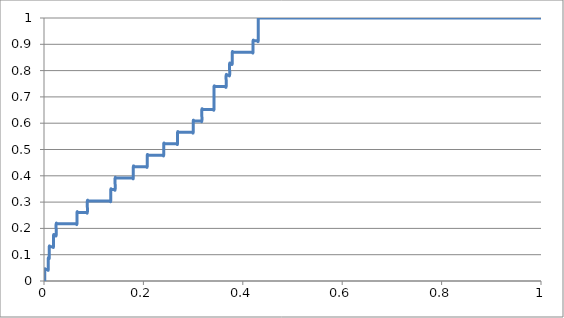
| Category | sens(y) |
|---|---|
| 0.0017452006980802626 | 0 |
| 0.0017452006980802626 | 0.043 |
| 0.003490401396160525 | 0.043 |
| 0.005235602094240788 | 0.043 |
| 0.006980802792321161 | 0.043 |
| 0.008726003490401424 | 0.043 |
| 0.008726003490401424 | 0.087 |
| 0.010471204188481686 | 0.087 |
| 0.010471204188481686 | 0.13 |
| 0.012216404886561949 | 0.13 |
| 0.013961605584642212 | 0.13 |
| 0.015706806282722474 | 0.13 |
| 0.017452006980802848 | 0.13 |
| 0.01919720767888311 | 0.13 |
| 0.01919720767888311 | 0.174 |
| 0.020942408376963373 | 0.174 |
| 0.022687609075043635 | 0.174 |
| 0.024432809773123898 | 0.174 |
| 0.024432809773123898 | 0.217 |
| 0.02617801047120416 | 0.217 |
| 0.027923211169284423 | 0.217 |
| 0.029668411867364797 | 0.217 |
| 0.03141361256544506 | 0.217 |
| 0.03315881326352532 | 0.217 |
| 0.034904013961605584 | 0.217 |
| 0.03664921465968585 | 0.217 |
| 0.03839441535776611 | 0.217 |
| 0.04013961605584637 | 0.217 |
| 0.041884816753926746 | 0.217 |
| 0.04363001745200701 | 0.217 |
| 0.04537521815008727 | 0.217 |
| 0.04712041884816753 | 0.217 |
| 0.048865619546247796 | 0.217 |
| 0.05061082024432806 | 0.217 |
| 0.05235602094240843 | 0.217 |
| 0.054101221640488695 | 0.217 |
| 0.05584642233856896 | 0.217 |
| 0.05759162303664922 | 0.217 |
| 0.05933682373472948 | 0.217 |
| 0.061082024432809745 | 0.217 |
| 0.06282722513089001 | 0.217 |
| 0.06457242582897038 | 0.217 |
| 0.06631762652705064 | 0.217 |
| 0.06631762652705064 | 0.261 |
| 0.0680628272251309 | 0.261 |
| 0.06980802792321117 | 0.261 |
| 0.07155322862129143 | 0.261 |
| 0.0732984293193717 | 0.261 |
| 0.07504363001745196 | 0.261 |
| 0.07678883071553233 | 0.261 |
| 0.07853403141361259 | 0.261 |
| 0.08027923211169286 | 0.261 |
| 0.08202443280977312 | 0.261 |
| 0.08376963350785338 | 0.261 |
| 0.08551483420593364 | 0.261 |
| 0.08726003490401402 | 0.261 |
| 0.08726003490401402 | 0.304 |
| 0.08900523560209428 | 0.304 |
| 0.09075043630017454 | 0.304 |
| 0.0924956369982548 | 0.304 |
| 0.09424083769633507 | 0.304 |
| 0.09598603839441533 | 0.304 |
| 0.09773123909249559 | 0.304 |
| 0.09947643979057597 | 0.304 |
| 0.10122164048865623 | 0.304 |
| 0.10296684118673649 | 0.304 |
| 0.10471204188481675 | 0.304 |
| 0.10645724258289702 | 0.304 |
| 0.10820244328097728 | 0.304 |
| 0.10994764397905754 | 0.304 |
| 0.11169284467713791 | 0.304 |
| 0.11343804537521818 | 0.304 |
| 0.11518324607329844 | 0.304 |
| 0.1169284467713787 | 0.304 |
| 0.11867364746945896 | 0.304 |
| 0.12041884816753923 | 0.304 |
| 0.1221640488656196 | 0.304 |
| 0.12390924956369986 | 0.304 |
| 0.12565445026178013 | 0.304 |
| 0.1273996509598604 | 0.304 |
| 0.12914485165794065 | 0.304 |
| 0.13089005235602091 | 0.304 |
| 0.13263525305410118 | 0.304 |
| 0.13438045375218155 | 0.304 |
| 0.13438045375218155 | 0.348 |
| 0.1361256544502618 | 0.348 |
| 0.13787085514834208 | 0.348 |
| 0.13961605584642234 | 0.348 |
| 0.1413612565445026 | 0.348 |
| 0.14310645724258286 | 0.348 |
| 0.14310645724258286 | 0.391 |
| 0.14485165794066313 | 0.391 |
| 0.1465968586387435 | 0.391 |
| 0.14834205933682376 | 0.391 |
| 0.15008726003490402 | 0.391 |
| 0.1518324607329843 | 0.391 |
| 0.15357766143106455 | 0.391 |
| 0.1553228621291448 | 0.391 |
| 0.15706806282722519 | 0.391 |
| 0.15881326352530545 | 0.391 |
| 0.1605584642233857 | 0.391 |
| 0.16230366492146597 | 0.391 |
| 0.16404886561954624 | 0.391 |
| 0.1657940663176265 | 0.391 |
| 0.16753926701570676 | 0.391 |
| 0.16928446771378713 | 0.391 |
| 0.1710296684118674 | 0.391 |
| 0.17277486910994766 | 0.391 |
| 0.17452006980802792 | 0.391 |
| 0.17626527050610818 | 0.391 |
| 0.17801047120418845 | 0.391 |
| 0.1797556719022687 | 0.391 |
| 0.1797556719022687 | 0.435 |
| 0.18150087260034908 | 0.435 |
| 0.18324607329842935 | 0.435 |
| 0.1849912739965096 | 0.435 |
| 0.18673647469458987 | 0.435 |
| 0.18848167539267013 | 0.435 |
| 0.1902268760907504 | 0.435 |
| 0.19197207678883077 | 0.435 |
| 0.19371727748691103 | 0.435 |
| 0.1954624781849913 | 0.435 |
| 0.19720767888307156 | 0.435 |
| 0.19895287958115182 | 0.435 |
| 0.20069808027923208 | 0.435 |
| 0.20244328097731235 | 0.435 |
| 0.20418848167539272 | 0.435 |
| 0.20593368237347298 | 0.435 |
| 0.20767888307155324 | 0.435 |
| 0.20767888307155324 | 0.478 |
| 0.2094240837696335 | 0.478 |
| 0.21116928446771377 | 0.478 |
| 0.21291448516579403 | 0.478 |
| 0.2146596858638743 | 0.478 |
| 0.21640488656195467 | 0.478 |
| 0.21815008726003493 | 0.478 |
| 0.2198952879581152 | 0.478 |
| 0.22164048865619546 | 0.478 |
| 0.22338568935427572 | 0.478 |
| 0.22513089005235598 | 0.478 |
| 0.22687609075043635 | 0.478 |
| 0.22862129144851662 | 0.478 |
| 0.23036649214659688 | 0.478 |
| 0.23211169284467714 | 0.478 |
| 0.2338568935427574 | 0.478 |
| 0.23560209424083767 | 0.478 |
| 0.23734729493891793 | 0.478 |
| 0.2390924956369983 | 0.478 |
| 0.24083769633507857 | 0.478 |
| 0.24083769633507857 | 0.522 |
| 0.24258289703315883 | 0.522 |
| 0.2443280977312391 | 0.522 |
| 0.24607329842931935 | 0.522 |
| 0.24781849912739962 | 0.522 |
| 0.24956369982547988 | 0.522 |
| 0.25130890052356025 | 0.522 |
| 0.2530541012216405 | 0.522 |
| 0.2547993019197208 | 0.522 |
| 0.25654450261780104 | 0.522 |
| 0.2582897033158813 | 0.522 |
| 0.26003490401396157 | 0.522 |
| 0.26178010471204194 | 0.522 |
| 0.2635253054101222 | 0.522 |
| 0.26527050610820246 | 0.522 |
| 0.2670157068062827 | 0.522 |
| 0.268760907504363 | 0.522 |
| 0.268760907504363 | 0.565 |
| 0.27050610820244325 | 0.565 |
| 0.2722513089005235 | 0.565 |
| 0.2739965095986039 | 0.565 |
| 0.27574171029668415 | 0.565 |
| 0.2774869109947644 | 0.565 |
| 0.2792321116928447 | 0.565 |
| 0.28097731239092494 | 0.565 |
| 0.2827225130890052 | 0.565 |
| 0.28446771378708546 | 0.565 |
| 0.28621291448516584 | 0.565 |
| 0.2879581151832461 | 0.565 |
| 0.28970331588132636 | 0.565 |
| 0.2914485165794066 | 0.565 |
| 0.2931937172774869 | 0.565 |
| 0.29493891797556715 | 0.565 |
| 0.2966841186736475 | 0.565 |
| 0.2984293193717278 | 0.565 |
| 0.30017452006980805 | 0.565 |
| 0.30017452006980805 | 0.609 |
| 0.3019197207678883 | 0.609 |
| 0.3036649214659686 | 0.609 |
| 0.30541012216404884 | 0.609 |
| 0.3071553228621291 | 0.609 |
| 0.3089005235602095 | 0.609 |
| 0.31064572425828973 | 0.609 |
| 0.31239092495637 | 0.609 |
| 0.31413612565445026 | 0.609 |
| 0.3158813263525305 | 0.609 |
| 0.3176265270506108 | 0.609 |
| 0.3176265270506108 | 0.652 |
| 0.31937172774869105 | 0.652 |
| 0.3211169284467714 | 0.652 |
| 0.3228621291448517 | 0.652 |
| 0.32460732984293195 | 0.652 |
| 0.3263525305410122 | 0.652 |
| 0.32809773123909247 | 0.652 |
| 0.32984293193717273 | 0.652 |
| 0.3315881326352531 | 0.652 |
| 0.33333333333333337 | 0.652 |
| 0.33507853403141363 | 0.652 |
| 0.3368237347294939 | 0.652 |
| 0.33856893542757416 | 0.652 |
| 0.3403141361256544 | 0.652 |
| 0.3420593368237347 | 0.652 |
| 0.3420593368237347 | 0.696 |
| 0.3420593368237347 | 0.739 |
| 0.34380453752181506 | 0.739 |
| 0.3455497382198953 | 0.739 |
| 0.3472949389179756 | 0.739 |
| 0.34904013961605584 | 0.739 |
| 0.3507853403141361 | 0.739 |
| 0.35253054101221637 | 0.739 |
| 0.35427574171029663 | 0.739 |
| 0.356020942408377 | 0.739 |
| 0.35776614310645727 | 0.739 |
| 0.35951134380453753 | 0.739 |
| 0.3612565445026178 | 0.739 |
| 0.36300174520069806 | 0.739 |
| 0.3647469458987783 | 0.739 |
| 0.3664921465968587 | 0.739 |
| 0.3664921465968587 | 0.783 |
| 0.36823734729493895 | 0.783 |
| 0.3699825479930192 | 0.783 |
| 0.3717277486910995 | 0.783 |
| 0.37347294938917974 | 0.783 |
| 0.37347294938917974 | 0.826 |
| 0.37521815008726 | 0.826 |
| 0.37696335078534027 | 0.826 |
| 0.37870855148342064 | 0.826 |
| 0.37870855148342064 | 0.87 |
| 0.3804537521815009 | 0.87 |
| 0.38219895287958117 | 0.87 |
| 0.38394415357766143 | 0.87 |
| 0.3856893542757417 | 0.87 |
| 0.38743455497382195 | 0.87 |
| 0.3891797556719022 | 0.87 |
| 0.3909249563699826 | 0.87 |
| 0.39267015706806285 | 0.87 |
| 0.3944153577661431 | 0.87 |
| 0.3961605584642234 | 0.87 |
| 0.39790575916230364 | 0.87 |
| 0.3996509598603839 | 0.87 |
| 0.4013961605584643 | 0.87 |
| 0.40314136125654454 | 0.87 |
| 0.4048865619546248 | 0.87 |
| 0.40663176265270506 | 0.87 |
| 0.4083769633507853 | 0.87 |
| 0.4101221640488656 | 0.87 |
| 0.41186736474694585 | 0.87 |
| 0.4136125654450262 | 0.87 |
| 0.4153577661431065 | 0.87 |
| 0.41710296684118675 | 0.87 |
| 0.418848167539267 | 0.87 |
| 0.4205933682373473 | 0.87 |
| 0.4205933682373473 | 0.913 |
| 0.42233856893542754 | 0.913 |
| 0.4240837696335078 | 0.913 |
| 0.4258289703315882 | 0.913 |
| 0.42757417102966844 | 0.913 |
| 0.4293193717277487 | 0.913 |
| 0.43106457242582896 | 0.913 |
| 0.43106457242582896 | 0.957 |
| 0.43106457242582896 | 1 |
| 0.4328097731239092 | 1 |
| 0.4345549738219895 | 1 |
| 0.43630017452006986 | 1 |
| 0.4380453752181501 | 1 |
| 0.4397905759162304 | 1 |
| 0.44153577661431065 | 1 |
| 0.4432809773123909 | 1 |
| 0.4450261780104712 | 1 |
| 0.44677137870855144 | 1 |
| 0.4485165794066318 | 1 |
| 0.4502617801047121 | 1 |
| 0.45200698080279234 | 1 |
| 0.4537521815008726 | 1 |
| 0.45549738219895286 | 1 |
| 0.4572425828970331 | 1 |
| 0.4589877835951134 | 1 |
| 0.46073298429319376 | 1 |
| 0.462478184991274 | 1 |
| 0.4642233856893543 | 1 |
| 0.46596858638743455 | 1 |
| 0.4677137870855148 | 1 |
| 0.46945898778359507 | 1 |
| 0.47120418848167545 | 1 |
| 0.4729493891797557 | 1 |
| 0.47469458987783597 | 1 |
| 0.47643979057591623 | 1 |
| 0.4781849912739965 | 1 |
| 0.47993019197207676 | 1 |
| 0.481675392670157 | 1 |
| 0.4834205933682374 | 1 |
| 0.48516579406631766 | 1 |
| 0.4869109947643979 | 1 |
| 0.4886561954624782 | 1 |
| 0.49040139616055844 | 1 |
| 0.4921465968586387 | 1 |
| 0.49389179755671897 | 1 |
| 0.49563699825479934 | 1 |
| 0.4973821989528796 | 1 |
| 0.49912739965095987 | 1 |
| 0.5008726003490401 | 1 |
| 0.5026178010471204 | 1 |
| 0.5043630017452008 | 1 |
| 0.506108202443281 | 1 |
| 0.5078534031413613 | 1 |
| 0.5095986038394416 | 1 |
| 0.5113438045375218 | 1 |
| 0.5130890052356021 | 1 |
| 0.5148342059336823 | 1 |
| 0.5165794066317626 | 1 |
| 0.5183246073298429 | 1 |
| 0.5200698080279231 | 1 |
| 0.5218150087260035 | 1 |
| 0.5235602094240838 | 1 |
| 0.525305410122164 | 1 |
| 0.5270506108202444 | 1 |
| 0.5287958115183247 | 1 |
| 0.5305410122164049 | 1 |
| 0.5322862129144852 | 1 |
| 0.5340314136125655 | 1 |
| 0.5357766143106457 | 1 |
| 0.537521815008726 | 1 |
| 0.5392670157068062 | 1 |
| 0.5410122164048865 | 1 |
| 0.5427574171029668 | 1 |
| 0.5445026178010471 | 1 |
| 0.5462478184991274 | 1 |
| 0.5479930191972077 | 1 |
| 0.549738219895288 | 1 |
| 0.5514834205933683 | 1 |
| 0.5532286212914486 | 1 |
| 0.5549738219895288 | 1 |
| 0.5567190226876091 | 1 |
| 0.5584642233856894 | 1 |
| 0.5602094240837696 | 1 |
| 0.5619546247818499 | 1 |
| 0.5636998254799301 | 1 |
| 0.5654450261780104 | 1 |
| 0.5671902268760908 | 1 |
| 0.568935427574171 | 1 |
| 0.5706806282722513 | 1 |
| 0.5724258289703316 | 1 |
| 0.5741710296684119 | 1 |
| 0.5759162303664922 | 1 |
| 0.5776614310645725 | 1 |
| 0.5794066317626527 | 1 |
| 0.581151832460733 | 1 |
| 0.5828970331588132 | 1 |
| 0.5846422338568935 | 1 |
| 0.5863874345549738 | 1 |
| 0.588132635253054 | 1 |
| 0.5898778359511343 | 1 |
| 0.5916230366492147 | 1 |
| 0.5933682373472949 | 1 |
| 0.5951134380453752 | 1 |
| 0.5968586387434556 | 1 |
| 0.5986038394415358 | 1 |
| 0.6003490401396161 | 1 |
| 0.6020942408376964 | 1 |
| 0.6038394415357766 | 1 |
| 0.6055846422338569 | 1 |
| 0.6073298429319371 | 1 |
| 0.6090750436300174 | 1 |
| 0.6108202443280977 | 1 |
| 0.6125654450261779 | 1 |
| 0.6143106457242583 | 1 |
| 0.6160558464223386 | 1 |
| 0.6178010471204188 | 1 |
| 0.6195462478184992 | 1 |
| 0.6212914485165795 | 1 |
| 0.6230366492146597 | 1 |
| 0.62478184991274 | 1 |
| 0.6265270506108203 | 1 |
| 0.6282722513089005 | 1 |
| 0.6300174520069808 | 1 |
| 0.631762652705061 | 1 |
| 0.6335078534031413 | 1 |
| 0.6352530541012216 | 1 |
| 0.6369982547993019 | 1 |
| 0.6387434554973822 | 1 |
| 0.6404886561954625 | 1 |
| 0.6422338568935427 | 1 |
| 0.6439790575916231 | 1 |
| 0.6457242582897034 | 1 |
| 0.6474694589877836 | 1 |
| 0.6492146596858639 | 1 |
| 0.6509598603839442 | 1 |
| 0.6527050610820244 | 1 |
| 0.6544502617801047 | 1 |
| 0.6561954624781849 | 1 |
| 0.6579406631762652 | 1 |
| 0.6596858638743455 | 1 |
| 0.6614310645724258 | 1 |
| 0.6631762652705061 | 1 |
| 0.6649214659685864 | 1 |
| 0.6666666666666667 | 1 |
| 0.668411867364747 | 1 |
| 0.6701570680628273 | 1 |
| 0.6719022687609075 | 1 |
| 0.6736474694589878 | 1 |
| 0.675392670157068 | 1 |
| 0.6771378708551483 | 1 |
| 0.6788830715532286 | 1 |
| 0.6806282722513088 | 1 |
| 0.6823734729493891 | 1 |
| 0.6841186736474695 | 1 |
| 0.6858638743455497 | 1 |
| 0.68760907504363 | 1 |
| 0.6893542757417104 | 1 |
| 0.6910994764397906 | 1 |
| 0.6928446771378709 | 1 |
| 0.6945898778359512 | 1 |
| 0.6963350785340314 | 1 |
| 0.6980802792321117 | 1 |
| 0.699825479930192 | 1 |
| 0.7015706806282722 | 1 |
| 0.7033158813263525 | 1 |
| 0.7050610820244327 | 1 |
| 0.7068062827225131 | 1 |
| 0.7085514834205934 | 1 |
| 0.7102966841186736 | 1 |
| 0.7120418848167539 | 1 |
| 0.7137870855148343 | 1 |
| 0.7155322862129145 | 1 |
| 0.7172774869109948 | 1 |
| 0.7190226876090751 | 1 |
| 0.7207678883071553 | 1 |
| 0.7225130890052356 | 1 |
| 0.7242582897033158 | 1 |
| 0.7260034904013961 | 1 |
| 0.7277486910994764 | 1 |
| 0.7294938917975566 | 1 |
| 0.731239092495637 | 1 |
| 0.7329842931937173 | 1 |
| 0.7347294938917975 | 1 |
| 0.7364746945898779 | 1 |
| 0.7382198952879582 | 1 |
| 0.7399650959860384 | 1 |
| 0.7417102966841187 | 1 |
| 0.743455497382199 | 1 |
| 0.7452006980802792 | 1 |
| 0.7469458987783595 | 1 |
| 0.7486910994764397 | 1 |
| 0.75043630017452 | 1 |
| 0.7521815008726004 | 1 |
| 0.7539267015706806 | 1 |
| 0.7556719022687609 | 1 |
| 0.7574171029668412 | 1 |
| 0.7591623036649214 | 1 |
| 0.7609075043630018 | 1 |
| 0.7626527050610821 | 1 |
| 0.7643979057591623 | 1 |
| 0.7661431064572426 | 1 |
| 0.7678883071553229 | 1 |
| 0.7696335078534031 | 1 |
| 0.7713787085514834 | 1 |
| 0.7731239092495636 | 1 |
| 0.774869109947644 | 1 |
| 0.7766143106457243 | 1 |
| 0.7783595113438045 | 1 |
| 0.7801047120418848 | 1 |
| 0.7818499127399651 | 1 |
| 0.7835951134380454 | 1 |
| 0.7853403141361257 | 1 |
| 0.787085514834206 | 1 |
| 0.7888307155322862 | 1 |
| 0.7905759162303665 | 1 |
| 0.7923211169284468 | 1 |
| 0.794066317626527 | 1 |
| 0.7958115183246073 | 1 |
| 0.7975567190226875 | 1 |
| 0.7993019197207679 | 1 |
| 0.8010471204188482 | 1 |
| 0.8027923211169284 | 1 |
| 0.8045375218150087 | 1 |
| 0.806282722513089 | 1 |
| 0.8080279232111693 | 1 |
| 0.8097731239092496 | 1 |
| 0.8115183246073299 | 1 |
| 0.8132635253054101 | 1 |
| 0.8150087260034904 | 1 |
| 0.8167539267015707 | 1 |
| 0.8184991273996509 | 1 |
| 0.8202443280977312 | 1 |
| 0.8219895287958116 | 1 |
| 0.8237347294938918 | 1 |
| 0.8254799301919721 | 1 |
| 0.8272251308900523 | 1 |
| 0.8289703315881326 | 1 |
| 0.830715532286213 | 1 |
| 0.8324607329842932 | 1 |
| 0.8342059336823735 | 1 |
| 0.8359511343804538 | 1 |
| 0.837696335078534 | 1 |
| 0.8394415357766143 | 1 |
| 0.8411867364746946 | 1 |
| 0.8429319371727748 | 1 |
| 0.8446771378708552 | 1 |
| 0.8464223385689355 | 1 |
| 0.8481675392670157 | 1 |
| 0.849912739965096 | 1 |
| 0.8516579406631762 | 1 |
| 0.8534031413612566 | 1 |
| 0.8551483420593369 | 1 |
| 0.8568935427574171 | 1 |
| 0.8586387434554974 | 1 |
| 0.8603839441535777 | 1 |
| 0.8621291448516579 | 1 |
| 0.8638743455497382 | 1 |
| 0.8656195462478184 | 1 |
| 0.8673647469458987 | 1 |
| 0.8691099476439791 | 1 |
| 0.8708551483420593 | 1 |
| 0.8726003490401396 | 1 |
| 0.8743455497382199 | 1 |
| 0.8760907504363001 | 1 |
| 0.8778359511343805 | 1 |
| 0.8795811518324608 | 1 |
| 0.881326352530541 | 1 |
| 0.8830715532286213 | 1 |
| 0.8848167539267016 | 1 |
| 0.8865619546247818 | 1 |
| 0.8883071553228621 | 1 |
| 0.8900523560209423 | 1 |
| 0.8917975567190227 | 1 |
| 0.893542757417103 | 1 |
| 0.8952879581151832 | 1 |
| 0.8970331588132635 | 1 |
| 0.8987783595113438 | 1 |
| 0.9005235602094241 | 1 |
| 0.9022687609075044 | 1 |
| 0.9040139616055847 | 1 |
| 0.9057591623036649 | 1 |
| 0.9075043630017452 | 1 |
| 0.9092495636998255 | 1 |
| 0.9109947643979057 | 1 |
| 0.912739965095986 | 1 |
| 0.9144851657940664 | 1 |
| 0.9162303664921466 | 1 |
| 0.9179755671902269 | 1 |
| 0.9197207678883071 | 1 |
| 0.9214659685863874 | 1 |
| 0.9232111692844677 | 1 |
| 0.924956369982548 | 1 |
| 0.9267015706806283 | 1 |
| 0.9284467713787086 | 1 |
| 0.9301919720767888 | 1 |
| 0.9319371727748691 | 1 |
| 0.9336823734729494 | 1 |
| 0.9354275741710296 | 1 |
| 0.93717277486911 | 1 |
| 0.9389179755671903 | 1 |
| 0.9406631762652705 | 1 |
| 0.9424083769633508 | 1 |
| 0.944153577661431 | 1 |
| 0.9458987783595113 | 1 |
| 0.9476439790575917 | 1 |
| 0.9493891797556719 | 1 |
| 0.9511343804537522 | 1 |
| 0.9528795811518325 | 1 |
| 0.9546247818499127 | 1 |
| 0.956369982547993 | 1 |
| 0.9581151832460733 | 1 |
| 0.9598603839441536 | 1 |
| 0.9616055846422339 | 1 |
| 0.9633507853403142 | 1 |
| 0.9650959860383944 | 1 |
| 0.9668411867364747 | 1 |
| 0.9685863874345549 | 1 |
| 0.9703315881326352 | 1 |
| 0.9720767888307156 | 1 |
| 0.9738219895287958 | 1 |
| 0.9755671902268761 | 1 |
| 0.9773123909249564 | 1 |
| 0.9790575916230366 | 1 |
| 0.9808027923211169 | 1 |
| 0.9825479930191972 | 1 |
| 0.9842931937172775 | 1 |
| 0.9860383944153578 | 1 |
| 0.987783595113438 | 1 |
| 0.9895287958115183 | 1 |
| 0.9912739965095986 | 1 |
| 0.9930191972076788 | 1 |
| 0.9947643979057592 | 1 |
| 0.9965095986038395 | 1 |
| 0.9982547993019197 | 1 |
| 1.0 | 1 |